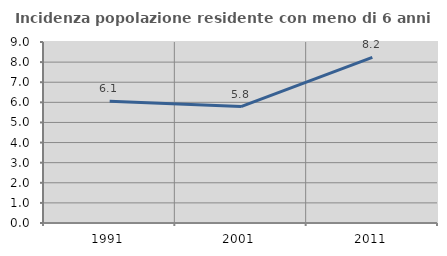
| Category | Incidenza popolazione residente con meno di 6 anni |
|---|---|
| 1991.0 | 6.051 |
| 2001.0 | 5.789 |
| 2011.0 | 8.231 |